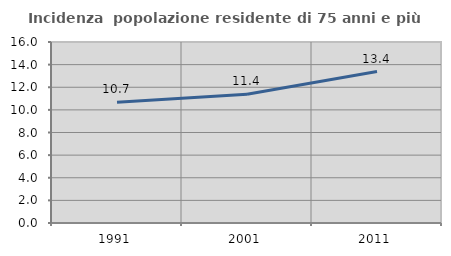
| Category | Incidenza  popolazione residente di 75 anni e più |
|---|---|
| 1991.0 | 10.68 |
| 2001.0 | 11.376 |
| 2011.0 | 13.387 |